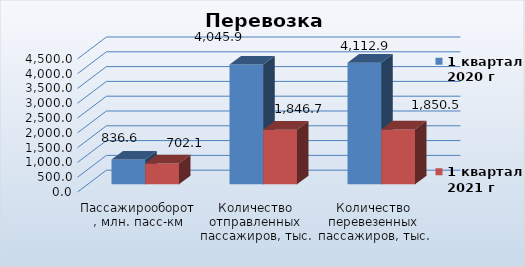
| Category | 1 квартал
2020 г | 1 квартал
2021 г |
|---|---|---|
| Пассажирооборот, млн. пасс-км | 836.6 | 702.1 |
| Количество отправленных пассажиров, тыс. чел. | 4045.9 | 1846.7 |
| Количество перевезенных пассажиров, тыс. чел. | 4112.9 | 1850.5 |